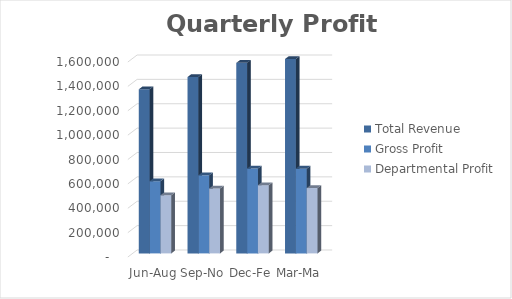
| Category | Total Revenue | Gross Profit | Departmental Profit |
|---|---|---|---|
| Jun-Aug | 1346571.77 | 592429.66 | 477281.24 |
| Sep-Nov | 1447282.28 | 641072.19 | 532959.7 |
| Dec-Feb | 1563415.6 | 696411.96 | 559770.76 |
| Mar-May | 1595232.7 | 695413.26 | 536329.97 |